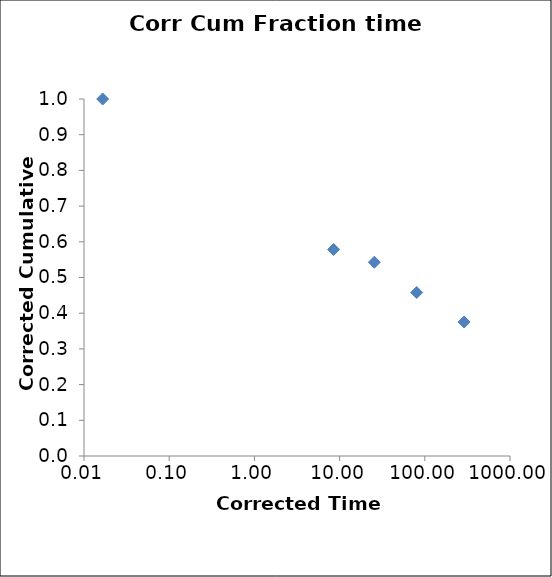
| Category | Corr Cum Fraction time series |
|---|---|
| 0.016587979455396 | 1 |
| 8.503615126036857 | 0.579 |
| 25.58410834152864 | 0.543 |
| 80.37972452246466 | 0.458 |
| 289.3284397263658 | 0.375 |